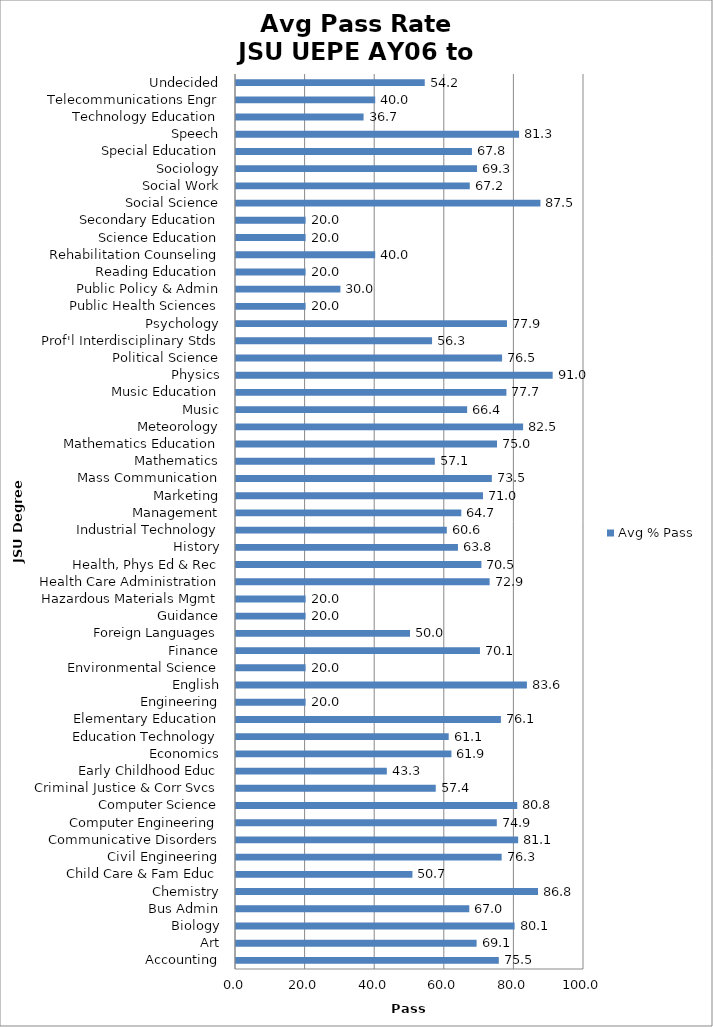
| Category | Avg % Pass |
|---|---|
| Accounting | 75.52 |
| Art | 69.14 |
| Biology | 80.06 |
| Bus Admin | 67.04 |
| Chemistry | 86.78 |
| Child Care & Fam Educ | 50.7 |
| Civil Engineering | 76.34 |
| Communicative Disorders | 81.08 |
| Computer Engineering | 74.94 |
| Computer Science | 80.82 |
| Criminal Justice & Corr Svcs | 57.4 |
| Early Childhood Educ | 43.34 |
| Economics | 61.9 |
| Education Technology | 61.12 |
| Elementary Education | 76.12 |
| Engineering | 20 |
| English | 83.6 |
| Environmental Science | 20 |
| Finance | 70.1 |
| Foreign Languages | 50 |
| Guidance | 20 |
| Hazardous Materials Mgmt | 20 |
| Health Care Administration | 72.88 |
| Health, Phys Ed & Rec | 70.52 |
| History | 63.78 |
| Industrial Technology | 60.58 |
| Management | 64.74 |
| Marketing | 70.98 |
| Mass Communication | 73.52 |
| Mathematics | 57.14 |
| Mathematics Education | 75 |
| Meteorology | 82.5 |
| Music | 66.42 |
| Music Education | 77.7 |
| Physics | 91 |
| Political Science | 76.46 |
| Prof'l Interdisciplinary Stds | 56.34 |
| Psychology | 77.86 |
| Public Health Sciences | 20 |
| Public Policy & Admin | 30 |
| Reading Education | 20 |
| Rehabilitation Counseling | 40 |
| Science Education | 20 |
| Secondary Education | 20 |
| Social Science | 87.48 |
| Social Work | 67.18 |
| Sociology | 69.26 |
| Special Education | 67.8 |
| Speech | 81.34 |
| Technology Education | 36.66 |
| Telecommunications Engr | 40 |
| Undecided | 54.24 |